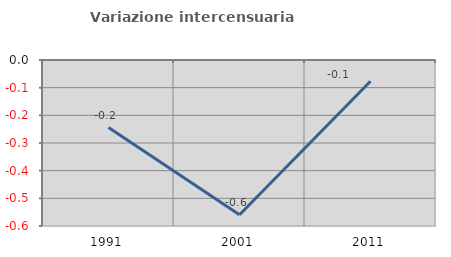
| Category | Variazione intercensuaria annua |
|---|---|
| 1991.0 | -0.244 |
| 2001.0 | -0.559 |
| 2011.0 | -0.077 |